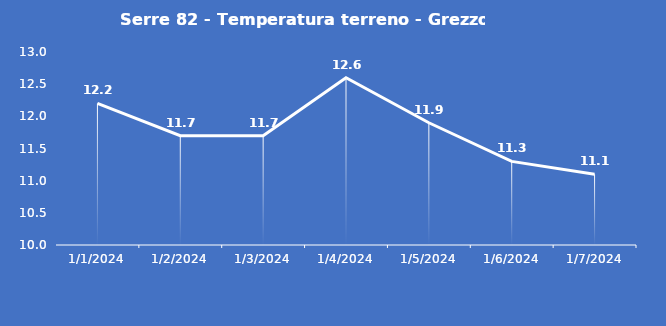
| Category | Serre 82 - Temperatura terreno - Grezzo (°C) |
|---|---|
| 1/1/24 | 12.2 |
| 1/2/24 | 11.7 |
| 1/3/24 | 11.7 |
| 1/4/24 | 12.6 |
| 1/5/24 | 11.9 |
| 1/6/24 | 11.3 |
| 1/7/24 | 11.1 |